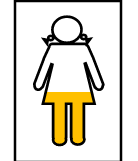
| Category | Series 0 | Series 1 |
|---|---|---|
| 0 | 0.4 | 0.4 |